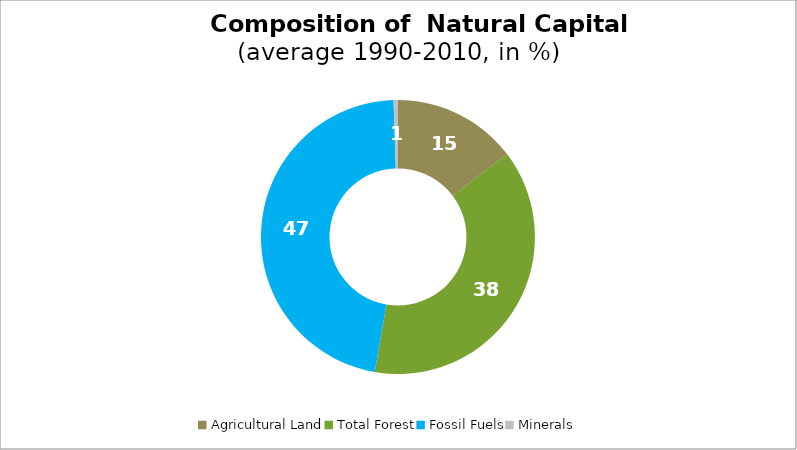
| Category | Series 0 |
|---|---|
| Agricultural Land | 14.686 |
| Total Forest | 38.026 |
| Fossil Fuels | 46.775 |
| Minerals | 0.513 |